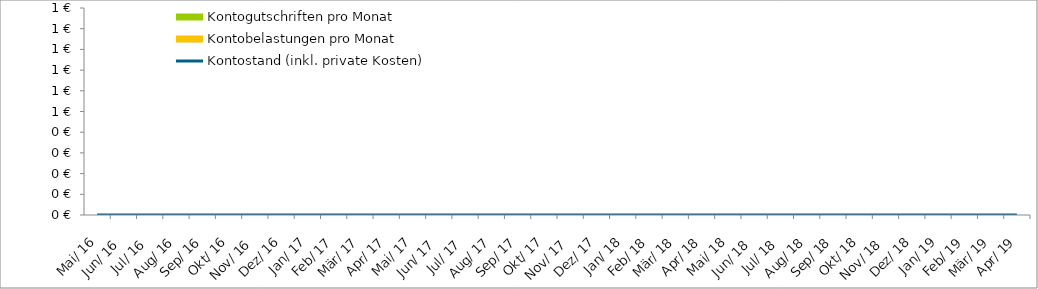
| Category | Kontogutschriften pro Monat | Kontobelastungen pro Monat |
|---|---|---|
| 2016-05-01 | 0 | 0 |
| 2016-06-01 | 0 | 0 |
| 2016-07-01 | 0 | 0 |
| 2016-08-01 | 0 | 0 |
| 2016-09-01 | 0 | 0 |
| 2016-10-01 | 0 | 0 |
| 2016-11-01 | 0 | 0 |
| 2016-12-01 | 0 | 0 |
| 2017-01-01 | 0 | 0 |
| 2017-02-01 | 0 | 0 |
| 2017-03-01 | 0 | 0 |
| 2017-04-01 | 0 | 0 |
| 2017-05-01 | 0 | 0 |
| 2017-06-01 | 0 | 0 |
| 2017-07-01 | 0 | 0 |
| 2017-08-01 | 0 | 0 |
| 2017-09-01 | 0 | 0 |
| 2017-10-01 | 0 | 0 |
| 2017-11-01 | 0 | 0 |
| 2017-12-01 | 0 | 0 |
| 2018-01-01 | 0 | 0 |
| 2018-02-01 | 0 | 0 |
| 2018-03-01 | 0 | 0 |
| 2018-04-01 | 0 | 0 |
| 2018-05-01 | 0 | 0 |
| 2018-06-01 | 0 | 0 |
| 2018-07-01 | 0 | 0 |
| 2018-08-01 | 0 | 0 |
| 2018-09-01 | 0 | 0 |
| 2018-10-01 | 0 | 0 |
| 2018-11-01 | 0 | 0 |
| 2018-12-01 | 0 | 0 |
| 2019-01-01 | 0 | 0 |
| 2019-02-01 | 0 | 0 |
| 2019-03-01 | 0 | 0 |
| 2019-04-01 | 0 | 0 |